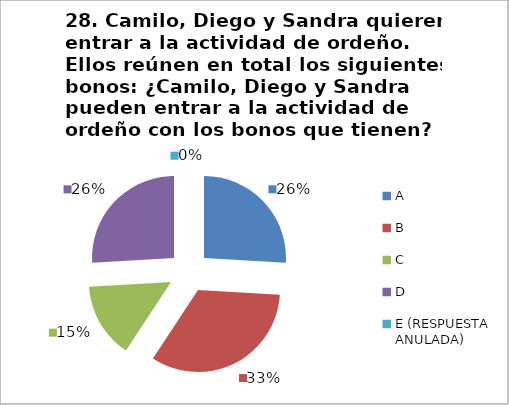
| Category | CANTIDAD DE RESPUESTAS PREGUNTA (28) | PORCENTAJE |
|---|---|---|
| A | 7 | 0.259 |
| B | 9 | 0.333 |
| C | 4 | 0.148 |
| D | 7 | 0.259 |
| E (RESPUESTA ANULADA) | 0 | 0 |